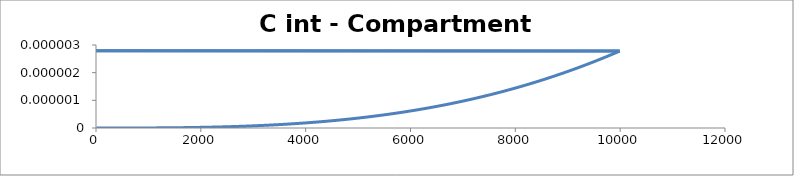
| Category | C - Sys 4 |
|---|---|
| 10.0 | 0 |
| 20.0 | 0 |
| 30.0 | 0 |
| 40.0 | 0 |
| 50.0 | 0 |
| 60.0 | 0 |
| 70.0 | 0 |
| 80.0 | 0 |
| 90.00000000000001 | 0 |
| 100.0 | 0 |
| 110.0 | 0 |
| 120.0 | 0 |
| 130.0 | 0 |
| 140.0 | 0 |
| 150.0 | 0 |
| 160.0 | 0 |
| 170.0 | 0 |
| 180.00000000000003 | 0 |
| 190.0 | 0 |
| 200.0 | 0 |
| 210.0 | 0 |
| 220.0 | 0 |
| 230.0 | 0 |
| 240.0 | 0 |
| 250.0 | 0 |
| 260.0 | 0 |
| 270.0 | 0 |
| 280.0 | 0 |
| 290.0 | 0 |
| 300.0 | 0 |
| 310.0 | 0 |
| 320.0 | 0 |
| 330.0 | 0 |
| 340.0 | 0 |
| 350.00000000000006 | 0 |
| 360.00000000000006 | 0 |
| 370.0 | 0 |
| 380.0 | 0 |
| 390.0 | 0 |
| 400.0 | 0 |
| 410.0 | 0 |
| 420.0 | 0 |
| 430.00000000000006 | 0 |
| 440.0 | 0 |
| 450.0 | 0 |
| 460.0 | 0 |
| 470.0 | 0 |
| 480.0 | 0 |
| 490.0 | 0 |
| 500.0 | 0 |
| 510.00000000000006 | 0 |
| 520.0 | 0 |
| 530.0 | 0 |
| 540.0 | 0 |
| 550.0 | 0 |
| 560.0 | 0 |
| 570.0 | 0 |
| 580.0 | 0 |
| 590.0 | 0 |
| 600.0 | 0 |
| 610.0 | 0 |
| 620.0 | 0 |
| 630.0 | 0 |
| 640.0 | 0 |
| 650.0 | 0 |
| 660.0 | 0 |
| 670.0 | 0 |
| 680.0 | 0 |
| 690.0000000000001 | 0 |
| 700.0000000000001 | 0 |
| 710.0000000000001 | 0 |
| 720.0000000000001 | 0 |
| 730.0 | 0 |
| 740.0 | 0 |
| 750.0 | 0 |
| 760.0 | 0 |
| 770.0 | 0 |
| 780.0 | 0 |
| 790.0 | 0 |
| 800.0 | 0 |
| 810.0 | 0 |
| 820.0 | 0 |
| 830.0 | 0 |
| 840.0 | 0 |
| 850.0000000000001 | 0 |
| 860.0000000000001 | 0 |
| 870.0000000000001 | 0 |
| 880.0 | 0 |
| 890.0 | 0 |
| 900.0 | 0 |
| 910.0 | 0 |
| 920.0 | 0 |
| 930.0 | 0 |
| 940.0 | 0 |
| 950.0 | 0 |
| 960.0 | 0 |
| 970.0 | 0 |
| 980.0 | 0 |
| 990.0 | 0 |
| 1000.0 | 0 |
| 1010.0000000000001 | 0 |
| 1020.0000000000001 | 0 |
| 1030.0 | 0 |
| 1040.0 | 0 |
| 1050.0 | 0 |
| 1060.0 | 0 |
| 1070.0 | 0 |
| 1080.0 | 0 |
| 1090.0 | 0 |
| 1100.0 | 0 |
| 1110.0 | 0 |
| 1120.0 | 0 |
| 1130.0 | 0 |
| 1140.0 | 0 |
| 1150.0 | 0 |
| 1160.0 | 0 |
| 1170.0 | 0 |
| 1180.0 | 0 |
| 1190.0 | 0 |
| 1200.0 | 0 |
| 1210.0 | 0 |
| 1220.0 | 0 |
| 1230.0 | 0 |
| 1240.0 | 0 |
| 1250.0 | 0 |
| 1260.0 | 0 |
| 1270.0 | 0 |
| 1280.0 | 0 |
| 1290.0 | 0 |
| 1300.0 | 0 |
| 1310.0 | 0 |
| 1320.0 | 0 |
| 1330.0 | 0 |
| 1340.0 | 0 |
| 1350.0 | 0 |
| 1360.0 | 0 |
| 1370.0 | 0 |
| 1380.0000000000002 | 0 |
| 1390.0000000000002 | 0 |
| 1400.0000000000002 | 0 |
| 1410.0000000000002 | 0 |
| 1420.0000000000002 | 0 |
| 1430.0000000000002 | 0 |
| 1440.0000000000002 | 0 |
| 1450.0 | 0 |
| 1460.0 | 0 |
| 1470.0 | 0 |
| 1480.0 | 0 |
| 1490.0 | 0 |
| 1500.0 | 0 |
| 1510.0 | 0 |
| 1520.0 | 0 |
| 1530.0 | 0 |
| 1540.0 | 0 |
| 1550.0 | 0 |
| 1560.0 | 0 |
| 1570.0 | 0 |
| 1580.0 | 0 |
| 1590.0 | 0 |
| 1600.0 | 0 |
| 1610.0 | 0 |
| 1620.0 | 0 |
| 1630.0 | 0 |
| 1640.0 | 0 |
| 1650.0 | 0 |
| 1660.0 | 0 |
| 1670.0 | 0 |
| 1680.0 | 0 |
| 1690.0 | 0 |
| 1700.0000000000002 | 0 |
| 1710.0000000000002 | 0 |
| 1720.0000000000002 | 0 |
| 1730.0000000000002 | 0 |
| 1740.0000000000002 | 0 |
| 1750.0000000000002 | 0 |
| 1760.0 | 0 |
| 1770.0 | 0 |
| 1780.0 | 0 |
| 1790.0 | 0 |
| 1800.0 | 0 |
| 1810.0 | 0 |
| 1820.0 | 0 |
| 1830.0 | 0 |
| 1840.0 | 0 |
| 1850.0 | 0 |
| 1860.0 | 0 |
| 1870.0 | 0 |
| 1880.0 | 0 |
| 1890.0 | 0 |
| 1900.0 | 0 |
| 1910.0 | 0 |
| 1920.0 | 0 |
| 1930.0 | 0 |
| 1940.0 | 0 |
| 1950.0 | 0 |
| 1960.0 | 0 |
| 1970.0 | 0 |
| 1980.0 | 0 |
| 1990.0 | 0 |
| 2000.0 | 0 |
| 2010.0000000000002 | 0 |
| 2020.0000000000002 | 0 |
| 2030.0000000000002 | 0 |
| 2040.0000000000002 | 0 |
| 2050.0 | 0 |
| 2060.0 | 0 |
| 2070.0 | 0 |
| 2080.0 | 0 |
| 2090.0 | 0 |
| 2100.0 | 0 |
| 2110.0 | 0 |
| 2120.0 | 0 |
| 2130.0 | 0 |
| 2140.0 | 0 |
| 2150.0 | 0 |
| 2160.0 | 0 |
| 2170.0 | 0 |
| 2180.0 | 0 |
| 2190.0 | 0 |
| 2200.0 | 0 |
| 2210.0 | 0 |
| 2220.0 | 0 |
| 2230.0 | 0 |
| 2240.0 | 0 |
| 2250.0 | 0 |
| 2260.0 | 0 |
| 2270.0 | 0 |
| 2280.0 | 0 |
| 2290.0 | 0 |
| 2300.0 | 0 |
| 2310.0 | 0 |
| 2320.0 | 0 |
| 2330.0 | 0 |
| 2340.0 | 0 |
| 2350.0 | 0 |
| 2360.0 | 0 |
| 2370.0 | 0 |
| 2380.0 | 0 |
| 2390.0 | 0 |
| 2400.0 | 0 |
| 2410.0 | 0 |
| 2420.0 | 0 |
| 2430.0 | 0 |
| 2440.0 | 0 |
| 2450.0 | 0 |
| 2460.0 | 0 |
| 2470.0 | 0 |
| 2480.0 | 0 |
| 2490.0 | 0 |
| 2500.0 | 0 |
| 2510.0 | 0 |
| 2520.0 | 0 |
| 2530.0 | 0 |
| 2540.0 | 0 |
| 2550.0 | 0 |
| 2560.0 | 0 |
| 2570.0 | 0 |
| 2580.0 | 0 |
| 2590.0 | 0 |
| 2600.0 | 0 |
| 2610.0 | 0 |
| 2620.0 | 0 |
| 2630.0 | 0 |
| 2640.0 | 0 |
| 2650.0 | 0 |
| 2660.0 | 0 |
| 2670.0 | 0 |
| 2680.0 | 0 |
| 2690.0 | 0 |
| 2700.0 | 0 |
| 2710.0 | 0 |
| 2720.0 | 0 |
| 2730.0 | 0 |
| 2740.0 | 0 |
| 2750.0 | 0 |
| 2760.0000000000005 | 0 |
| 2770.0000000000005 | 0 |
| 2780.0000000000005 | 0 |
| 2790.0000000000005 | 0 |
| 2800.0000000000005 | 0 |
| 2810.0000000000005 | 0 |
| 2820.0000000000005 | 0 |
| 2830.0000000000005 | 0 |
| 2840.0000000000005 | 0 |
| 2850.0000000000005 | 0 |
| 2860.0000000000005 | 0 |
| 2870.0000000000005 | 0 |
| 2880.0000000000005 | 0 |
| 2890.0 | 0 |
| 2900.0 | 0 |
| 2910.0 | 0 |
| 2920.0 | 0 |
| 2930.0 | 0 |
| 2940.0 | 0 |
| 2950.0 | 0 |
| 2960.0 | 0 |
| 2970.0 | 0 |
| 2980.0 | 0 |
| 2990.0 | 0 |
| 3000.0 | 0 |
| 3010.0 | 0 |
| 3020.0 | 0 |
| 3030.0 | 0 |
| 3040.0 | 0 |
| 3050.0 | 0 |
| 3060.0 | 0 |
| 3070.0 | 0 |
| 3080.0 | 0 |
| 3090.0 | 0 |
| 3100.0 | 0 |
| 3110.0 | 0 |
| 3120.0 | 0 |
| 3130.0 | 0 |
| 3140.0 | 0 |
| 3150.0 | 0 |
| 3160.0 | 0 |
| 3170.0 | 0 |
| 3180.0 | 0 |
| 3190.0 | 0 |
| 3200.0 | 0 |
| 3210.0 | 0 |
| 3220.0 | 0 |
| 3230.0 | 0 |
| 3240.0 | 0 |
| 3250.0 | 0 |
| 3260.0 | 0 |
| 3270.0 | 0 |
| 3280.0 | 0 |
| 3290.0 | 0 |
| 3300.0 | 0 |
| 3310.0 | 0 |
| 3320.0 | 0 |
| 3330.0 | 0 |
| 3340.0 | 0 |
| 3350.0 | 0 |
| 3360.0 | 0 |
| 3370.0 | 0 |
| 3380.0 | 0 |
| 3390.0000000000005 | 0 |
| 3400.0000000000005 | 0 |
| 3410.0000000000005 | 0 |
| 3420.0000000000005 | 0 |
| 3430.0000000000005 | 0 |
| 3440.0000000000005 | 0 |
| 3450.0000000000005 | 0 |
| 3460.0000000000005 | 0 |
| 3470.0000000000005 | 0 |
| 3480.0000000000005 | 0 |
| 3490.0000000000005 | 0 |
| 3500.0000000000005 | 0 |
| 3510.0000000000005 | 0 |
| 3520.0 | 0 |
| 3530.0 | 0 |
| 3540.0 | 0 |
| 3550.0 | 0 |
| 3560.0 | 0 |
| 3570.0 | 0 |
| 3580.0 | 0 |
| 3590.0 | 0 |
| 3600.0 | 0 |
| 3610.0 | 0 |
| 3620.0 | 0 |
| 3630.0 | 0 |
| 3640.0 | 0 |
| 3650.0 | 0 |
| 3660.0 | 0 |
| 3670.0 | 0 |
| 3680.0 | 0 |
| 3690.0 | 0 |
| 3700.0 | 0 |
| 3710.0 | 0 |
| 3720.0 | 0 |
| 3730.0 | 0 |
| 3740.0 | 0 |
| 3750.0 | 0 |
| 3760.0 | 0 |
| 3770.0 | 0 |
| 3780.0 | 0 |
| 3790.0 | 0 |
| 3800.0 | 0 |
| 3810.0 | 0 |
| 3820.0 | 0 |
| 3830.0 | 0 |
| 3840.0 | 0 |
| 3850.0 | 0 |
| 3860.0 | 0 |
| 3870.0 | 0 |
| 3880.0 | 0 |
| 3890.0 | 0 |
| 3900.0 | 0 |
| 3910.0 | 0 |
| 3920.0 | 0 |
| 3930.0 | 0 |
| 3940.0 | 0 |
| 3950.0 | 0 |
| 3960.0 | 0 |
| 3970.0 | 0 |
| 3980.0 | 0 |
| 3990.0 | 0 |
| 4000.0 | 0 |
| 4010.0000000000005 | 0 |
| 4020.0000000000005 | 0 |
| 4030.0000000000005 | 0 |
| 4040.0000000000005 | 0 |
| 4050.0000000000005 | 0 |
| 4060.0000000000005 | 0 |
| 4070.0000000000005 | 0 |
| 4080.0000000000005 | 0 |
| 4090.0000000000005 | 0 |
| 4100.0 | 0 |
| 4110.0 | 0 |
| 4120.0 | 0 |
| 4130.0 | 0 |
| 4140.0 | 0 |
| 4150.0 | 0 |
| 4160.0 | 0 |
| 4170.0 | 0 |
| 4180.0 | 0 |
| 4190.0 | 0 |
| 4200.0 | 0 |
| 4210.0 | 0 |
| 4220.0 | 0 |
| 4230.0 | 0 |
| 4240.0 | 0 |
| 4250.0 | 0 |
| 4260.0 | 0 |
| 4270.0 | 0 |
| 4280.0 | 0 |
| 4290.0 | 0 |
| 4300.0 | 0 |
| 4310.0 | 0 |
| 4320.0 | 0 |
| 4330.0 | 0 |
| 4340.0 | 0 |
| 4350.0 | 0 |
| 4360.0 | 0 |
| 4370.0 | 0 |
| 4380.0 | 0 |
| 4390.0 | 0 |
| 4400.0 | 0 |
| 4410.0 | 0 |
| 4420.0 | 0 |
| 4430.0 | 0 |
| 4440.0 | 0 |
| 4450.0 | 0 |
| 4460.0 | 0 |
| 4470.0 | 0 |
| 4480.0 | 0 |
| 4490.0 | 0 |
| 4500.0 | 0 |
| 4510.0 | 0 |
| 4520.0 | 0 |
| 4530.0 | 0 |
| 4540.0 | 0 |
| 4550.0 | 0 |
| 4560.0 | 0 |
| 4570.0 | 0 |
| 4580.0 | 0 |
| 4590.0 | 0 |
| 4600.0 | 0 |
| 4610.0 | 0 |
| 4620.0 | 0 |
| 4630.0 | 0 |
| 4640.0 | 0 |
| 4650.0 | 0 |
| 4660.0 | 0 |
| 4670.0 | 0 |
| 4680.0 | 0 |
| 4690.0 | 0 |
| 4700.0 | 0 |
| 4710.0 | 0 |
| 4720.0 | 0 |
| 4730.0 | 0 |
| 4740.0 | 0 |
| 4750.0 | 0 |
| 4760.0 | 0 |
| 4770.0 | 0 |
| 4780.0 | 0 |
| 4790.0 | 0 |
| 4800.0 | 0 |
| 4810.0 | 0 |
| 4820.0 | 0 |
| 4830.0 | 0 |
| 4840.0 | 0 |
| 4850.0 | 0 |
| 4860.0 | 0 |
| 4870.0 | 0 |
| 4880.0 | 0 |
| 4890.0 | 0 |
| 4900.0 | 0 |
| 4910.0 | 0 |
| 4920.0 | 0 |
| 4930.0 | 0 |
| 4940.0 | 0 |
| 4950.0 | 0 |
| 4960.0 | 0 |
| 4970.0 | 0 |
| 4980.0 | 0 |
| 4990.0 | 0 |
| 5000.0 | 0 |
| 5010.0 | 0 |
| 5020.0 | 0 |
| 5030.0 | 0 |
| 5040.0 | 0 |
| 5050.0 | 0 |
| 5060.0 | 0 |
| 5070.0 | 0 |
| 5080.0 | 0 |
| 5090.0 | 0 |
| 5100.0 | 0 |
| 5110.0 | 0 |
| 5120.0 | 0 |
| 5130.0 | 0 |
| 5140.0 | 0 |
| 5150.0 | 0 |
| 5160.0 | 0 |
| 5170.0 | 0 |
| 5180.0 | 0 |
| 5190.0 | 0 |
| 5200.0 | 0 |
| 5210.0 | 0 |
| 5220.0 | 0 |
| 5230.0 | 0 |
| 5240.0 | 0 |
| 5250.0 | 0 |
| 5260.0 | 0 |
| 5270.0 | 0 |
| 5280.0 | 0 |
| 5290.0 | 0 |
| 5300.0 | 0 |
| 5310.0 | 0 |
| 5320.0 | 0 |
| 5330.0 | 0 |
| 5340.0 | 0 |
| 5350.0 | 0 |
| 5360.0 | 0 |
| 5370.0 | 0 |
| 5380.0 | 0 |
| 5390.0 | 0 |
| 5400.0 | 0 |
| 5410.0 | 0 |
| 5420.0 | 0 |
| 5430.0 | 0 |
| 5440.0 | 0 |
| 5450.0 | 0 |
| 5460.0 | 0 |
| 5470.0 | 0 |
| 5480.0 | 0 |
| 5490.0 | 0 |
| 5500.0 | 0 |
| 5510.0 | 0 |
| 5520.000000000001 | 0 |
| 5530.000000000001 | 0 |
| 5540.000000000001 | 0 |
| 5550.000000000001 | 0 |
| 5560.000000000001 | 0 |
| 5570.000000000001 | 0 |
| 5580.000000000001 | 0 |
| 5590.000000000001 | 0 |
| 5600.000000000001 | 0 |
| 5610.000000000001 | 0 |
| 5620.000000000001 | 0 |
| 5630.000000000001 | 0 |
| 5640.000000000001 | 0 |
| 5650.000000000001 | 0 |
| 5660.000000000001 | 0 |
| 5670.000000000001 | 0 |
| 5680.000000000001 | 0 |
| 5690.000000000001 | 0 |
| 5700.000000000001 | 0 |
| 5710.000000000001 | 0 |
| 5720.000000000001 | 0 |
| 5730.000000000001 | 0 |
| 5740.000000000001 | 0 |
| 5750.000000000001 | 0 |
| 5760.000000000001 | 0 |
| 5770.0 | 0 |
| 5780.0 | 0 |
| 5790.0 | 0 |
| 5800.0 | 0 |
| 5810.0 | 0 |
| 5820.0 | 0 |
| 5830.0 | 0 |
| 5840.0 | 0 |
| 5850.0 | 0 |
| 5860.0 | 0 |
| 5870.0 | 0 |
| 5880.0 | 0 |
| 5890.0 | 0 |
| 5900.0 | 0 |
| 5910.0 | 0 |
| 5920.0 | 0 |
| 5930.0 | 0 |
| 5940.0 | 0 |
| 5950.0 | 0 |
| 5960.0 | 0 |
| 5970.0 | 0 |
| 5980.0 | 0 |
| 5990.0 | 0 |
| 6000.0 | 0 |
| 6010.0 | 0 |
| 6020.0 | 0 |
| 6030.0 | 0 |
| 6040.0 | 0 |
| 6050.0 | 0 |
| 6060.0 | 0 |
| 6070.0 | 0 |
| 6080.0 | 0 |
| 6090.0 | 0 |
| 6100.0 | 0 |
| 6110.0 | 0 |
| 6120.0 | 0 |
| 6130.0 | 0 |
| 6140.0 | 0 |
| 6150.0 | 0 |
| 6160.0 | 0 |
| 6170.0 | 0 |
| 6180.0 | 0 |
| 6190.0 | 0 |
| 6200.0 | 0 |
| 6210.0 | 0 |
| 6220.0 | 0 |
| 6230.0 | 0 |
| 6240.0 | 0 |
| 6250.0 | 0 |
| 6260.0 | 0 |
| 6270.0 | 0 |
| 6280.0 | 0 |
| 6290.0 | 0 |
| 6300.0 | 0 |
| 6310.0 | 0 |
| 6320.0 | 0 |
| 6330.0 | 0 |
| 6340.0 | 0 |
| 6350.0 | 0 |
| 6360.0 | 0 |
| 6370.0 | 0 |
| 6380.0 | 0 |
| 6390.0 | 0 |
| 6400.0 | 0 |
| 6410.0 | 0 |
| 6420.0 | 0 |
| 6430.0 | 0 |
| 6440.0 | 0 |
| 6450.0 | 0 |
| 6460.0 | 0 |
| 6470.0 | 0 |
| 6480.0 | 0 |
| 6490.0 | 0 |
| 6500.0 | 0 |
| 6510.0 | 0 |
| 6520.0 | 0 |
| 6530.0 | 0 |
| 6540.0 | 0 |
| 6550.0 | 0 |
| 6560.0 | 0 |
| 6570.0 | 0 |
| 6580.0 | 0 |
| 6590.0 | 0 |
| 6600.0 | 0 |
| 6610.0 | 0 |
| 6620.0 | 0 |
| 6630.0 | 0 |
| 6640.0 | 0 |
| 6650.0 | 0 |
| 6660.0 | 0 |
| 6670.0 | 0 |
| 6680.0 | 0 |
| 6690.0 | 0 |
| 6700.0 | 0 |
| 6710.0 | 0 |
| 6720.0 | 0 |
| 6730.0 | 0 |
| 6740.0 | 0 |
| 6750.0 | 0 |
| 6760.0 | 0 |
| 6770.000000000001 | 0 |
| 6780.000000000001 | 0 |
| 6790.000000000001 | 0 |
| 6800.000000000001 | 0 |
| 6810.000000000001 | 0 |
| 6820.000000000001 | 0 |
| 6830.000000000001 | 0 |
| 6840.000000000001 | 0 |
| 6850.000000000001 | 0 |
| 6860.000000000001 | 0 |
| 6870.000000000001 | 0 |
| 6880.000000000001 | 0 |
| 6890.000000000001 | 0 |
| 6900.000000000001 | 0 |
| 6910.000000000001 | 0 |
| 6920.000000000001 | 0 |
| 6930.000000000001 | 0 |
| 6940.000000000001 | 0 |
| 6950.000000000001 | 0 |
| 6960.000000000001 | 0 |
| 6970.000000000001 | 0 |
| 6980.000000000001 | 0 |
| 6990.000000000001 | 0 |
| 7000.000000000001 | 0 |
| 7010.000000000001 | 0 |
| 7020.000000000001 | 0 |
| 7030.000000000001 | 0 |
| 7040.0 | 0 |
| 7050.0 | 0 |
| 7060.0 | 0 |
| 7070.0 | 0 |
| 7080.0 | 0 |
| 7090.0 | 0 |
| 7100.0 | 0 |
| 7110.0 | 0 |
| 7120.0 | 0 |
| 7130.0 | 0 |
| 7140.0 | 0 |
| 7150.0 | 0 |
| 7160.0 | 0 |
| 7170.0 | 0 |
| 7180.0 | 0 |
| 7190.0 | 0 |
| 7200.0 | 0 |
| 7210.0 | 0 |
| 7220.0 | 0 |
| 7230.0 | 0 |
| 7240.0 | 0 |
| 7250.0 | 0 |
| 7260.0 | 0 |
| 7270.0 | 0 |
| 7280.0 | 0 |
| 7290.0 | 0 |
| 7300.0 | 0 |
| 7310.0 | 0 |
| 7320.0 | 0 |
| 7330.0 | 0 |
| 7340.0 | 0 |
| 7350.0 | 0 |
| 7360.0 | 0 |
| 7370.0 | 0 |
| 7380.0 | 0 |
| 7390.0 | 0 |
| 7400.0 | 0 |
| 7410.0 | 0 |
| 7420.0 | 0 |
| 7430.0 | 0 |
| 7440.0 | 0 |
| 7450.0 | 0 |
| 7460.0 | 0 |
| 7470.0 | 0 |
| 7480.0 | 0 |
| 7490.0 | 0 |
| 7500.0 | 0 |
| 7510.0 | 0 |
| 7520.0 | 0 |
| 7530.0 | 0 |
| 7540.0 | 0 |
| 7550.0 | 0 |
| 7560.0 | 0 |
| 7570.0 | 0 |
| 7580.0 | 0 |
| 7590.0 | 0 |
| 7600.0 | 0 |
| 7610.0 | 0 |
| 7620.0 | 0 |
| 7630.0 | 0 |
| 7640.0 | 0 |
| 7650.0 | 0 |
| 7660.0 | 0 |
| 7670.0 | 0 |
| 7680.0 | 0 |
| 7690.0 | 0 |
| 7700.0 | 0 |
| 7710.0 | 0 |
| 7720.0 | 0 |
| 7730.0 | 0 |
| 7740.0 | 0 |
| 7750.0 | 0 |
| 7760.0 | 0 |
| 7770.0 | 0 |
| 7780.0 | 0 |
| 7790.0 | 0 |
| 7800.0 | 0 |
| 7810.0 | 0 |
| 7820.0 | 0 |
| 7830.0 | 0 |
| 7840.0 | 0 |
| 7850.0 | 0 |
| 7860.0 | 0 |
| 7870.0 | 0 |
| 7880.0 | 0 |
| 7890.0 | 0 |
| 7900.0 | 0 |
| 7910.0 | 0 |
| 7920.0 | 0 |
| 7930.0 | 0 |
| 7940.0 | 0 |
| 7950.0 | 0 |
| 7960.0 | 0 |
| 7970.0 | 0 |
| 7980.0 | 0 |
| 7990.0 | 0 |
| 8000.0 | 0 |
| 8010.0 | 0 |
| 8020.000000000001 | 0 |
| 8030.000000000001 | 0 |
| 8040.000000000001 | 0 |
| 8050.000000000001 | 0 |
| 8060.000000000001 | 0 |
| 8070.000000000001 | 0 |
| 8080.000000000001 | 0 |
| 8090.000000000001 | 0 |
| 8100.000000000001 | 0 |
| 8110.000000000001 | 0 |
| 8120.000000000001 | 0 |
| 8130.000000000001 | 0 |
| 8140.000000000001 | 0 |
| 8150.000000000001 | 0 |
| 8160.000000000001 | 0 |
| 8170.000000000001 | 0 |
| 8180.000000000001 | 0 |
| 8190.000000000001 | 0 |
| 8200.0 | 0 |
| 8210.0 | 0 |
| 8220.0 | 0 |
| 8230.0 | 0 |
| 8240.0 | 0 |
| 8250.0 | 0 |
| 8260.0 | 0 |
| 8270.0 | 0 |
| 8280.0 | 0 |
| 8290.0 | 0 |
| 8300.0 | 0 |
| 8310.0 | 0 |
| 8320.0 | 0 |
| 8330.0 | 0 |
| 8340.0 | 0 |
| 8350.0 | 0 |
| 8360.0 | 0 |
| 8370.0 | 0 |
| 8380.0 | 0 |
| 8390.0 | 0 |
| 8400.0 | 0 |
| 8410.0 | 0 |
| 8420.0 | 0 |
| 8430.0 | 0 |
| 8440.0 | 0 |
| 8450.0 | 0 |
| 8460.0 | 0 |
| 8470.0 | 0 |
| 8480.0 | 0 |
| 8490.0 | 0 |
| 8500.0 | 0 |
| 8510.0 | 0 |
| 8520.0 | 0 |
| 8530.0 | 0 |
| 8540.0 | 0 |
| 8550.0 | 0 |
| 8560.0 | 0 |
| 8570.0 | 0 |
| 8580.0 | 0 |
| 8590.0 | 0 |
| 8600.0 | 0 |
| 8610.0 | 0 |
| 8620.0 | 0 |
| 8630.0 | 0 |
| 8640.0 | 0 |
| 8650.0 | 0 |
| 8660.0 | 0 |
| 8670.0 | 0 |
| 8680.0 | 0 |
| 8690.0 | 0 |
| 8700.0 | 0 |
| 8710.0 | 0 |
| 8720.0 | 0 |
| 8730.0 | 0 |
| 8740.0 | 0 |
| 8750.0 | 0 |
| 8760.0 | 0 |
| 8770.0 | 0 |
| 8780.0 | 0 |
| 8790.0 | 0 |
| 8800.0 | 0 |
| 8810.0 | 0 |
| 8820.0 | 0 |
| 8830.0 | 0 |
| 8840.0 | 0 |
| 8850.0 | 0 |
| 8860.0 | 0 |
| 8870.0 | 0 |
| 8880.0 | 0 |
| 8890.0 | 0 |
| 8900.0 | 0 |
| 8910.0 | 0 |
| 8920.0 | 0 |
| 8930.0 | 0 |
| 8940.0 | 0 |
| 8950.0 | 0 |
| 8960.0 | 0 |
| 8970.0 | 0 |
| 8980.0 | 0 |
| 8990.0 | 0 |
| 9000.0 | 0 |
| 9010.0 | 0 |
| 9020.0 | 0 |
| 9030.0 | 0 |
| 9040.0 | 0 |
| 9050.0 | 0 |
| 9060.0 | 0 |
| 9070.0 | 0 |
| 9080.0 | 0 |
| 9090.0 | 0 |
| 9100.0 | 0 |
| 9110.0 | 0 |
| 9120.0 | 0 |
| 9130.0 | 0 |
| 9140.0 | 0 |
| 9150.0 | 0 |
| 9160.0 | 0 |
| 9170.0 | 0 |
| 9180.0 | 0 |
| 9190.0 | 0 |
| 9200.0 | 0 |
| 9210.0 | 0 |
| 9220.0 | 0 |
| 9230.0 | 0 |
| 9240.0 | 0 |
| 9250.0 | 0 |
| 9260.0 | 0 |
| 9270.0 | 0 |
| 9280.0 | 0 |
| 9290.0 | 0 |
| 9300.0 | 0 |
| 9310.0 | 0 |
| 9320.0 | 0 |
| 9330.0 | 0 |
| 9340.0 | 0 |
| 9350.0 | 0 |
| 9360.0 | 0 |
| 9370.0 | 0 |
| 9380.0 | 0 |
| 9390.0 | 0 |
| 9400.0 | 0 |
| 9410.0 | 0 |
| 9420.0 | 0 |
| 9430.0 | 0 |
| 9440.0 | 0 |
| 9450.0 | 0 |
| 9460.0 | 0 |
| 9470.0 | 0 |
| 9480.0 | 0 |
| 9490.0 | 0 |
| 9500.0 | 0 |
| 9510.0 | 0 |
| 9520.0 | 0 |
| 9530.0 | 0 |
| 9540.0 | 0 |
| 9550.0 | 0 |
| 9560.0 | 0 |
| 9570.0 | 0 |
| 9580.0 | 0 |
| 9590.0 | 0 |
| 9600.0 | 0 |
| 9610.0 | 0 |
| 9620.0 | 0 |
| 9630.0 | 0 |
| 9640.0 | 0 |
| 9650.0 | 0 |
| 9660.0 | 0 |
| 9670.0 | 0 |
| 9680.0 | 0 |
| 9690.0 | 0 |
| 9700.0 | 0 |
| 9710.0 | 0 |
| 9720.0 | 0 |
| 9730.0 | 0 |
| 9740.0 | 0 |
| 9750.0 | 0 |
| 9760.0 | 0 |
| 9770.0 | 0 |
| 9780.0 | 0 |
| 9790.0 | 0 |
| 9800.0 | 0 |
| 9810.0 | 0 |
| 9820.0 | 0 |
| 9830.0 | 0 |
| 9840.0 | 0 |
| 9850.0 | 0 |
| 9860.0 | 0 |
| 9870.0 | 0 |
| 9880.0 | 0 |
| 9890.0 | 0 |
| 9900.0 | 0 |
| 9910.0 | 0 |
| 9920.0 | 0 |
| 9930.0 | 0 |
| 9940.0 | 0 |
| 9950.0 | 0 |
| 9960.0 | 0 |
| 9970.0 | 0 |
| 9980.0 | 0 |
| 9990.0 | 0 |
| 10000.0 | 0 |